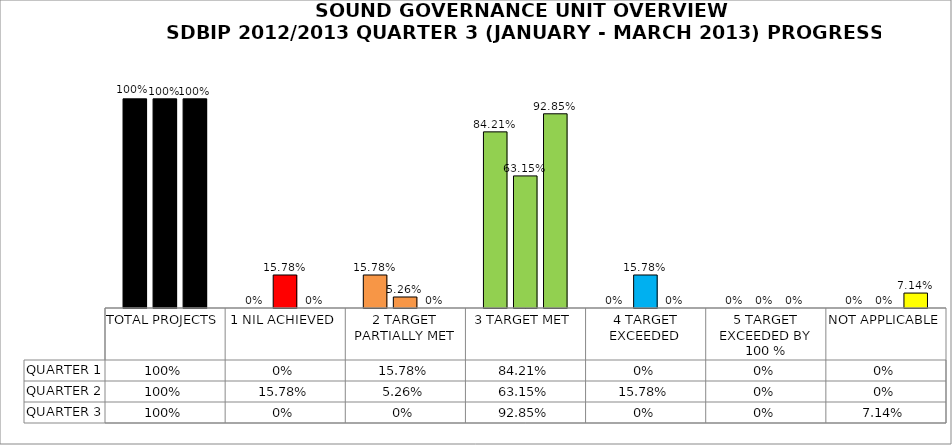
| Category | QUARTER 1 | QUARTER 2 | QUARTER 3 |
|---|---|---|---|
| TOTAL PROJECTS | 1 | 1 | 1 |
| 1 NIL ACHIEVED | 0 | 0.158 | 0 |
| 2 TARGET PARTIALLY MET | 0.158 | 0.053 | 0 |
| 3 TARGET MET | 0.842 | 0.632 | 0.928 |
| 4 TARGET EXCEEDED | 0 | 0.158 | 0 |
| 5 TARGET EXCEEDED BY 100 % | 0 | 0 | 0 |
| NOT APPLICABLE | 0 | 0 | 0.071 |